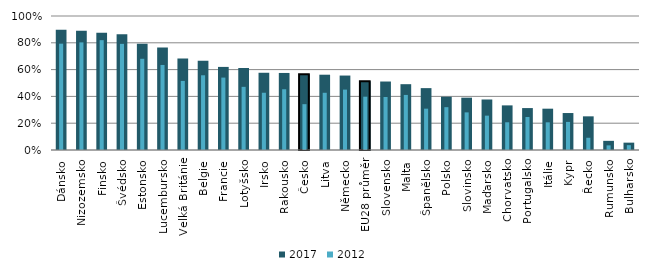
| Category | 2017 |
|---|---|
| Dánsko | 0.898 |
| Nizozemsko | 0.889 |
| Finsko | 0.874 |
| Švédsko | 0.865 |
| Estonsko | 0.792 |
| Lucembursko | 0.764 |
| Velká Británie | 0.684 |
| Belgie | 0.666 |
| Francie | 0.62 |
| Lotyšsko | 0.612 |
| Irsko | 0.576 |
| Rakousko | 0.575 |
| Česko | 0.566 |
| Litva | 0.562 |
| Německo | 0.556 |
| EU28 průměr | 0.513 |
| Slovensko | 0.511 |
| Malta | 0.491 |
| Španělsko | 0.462 |
| Polsko | 0.398 |
| Slovinsko | 0.391 |
| Maďarsko | 0.377 |
| Chorvatsko | 0.333 |
| Portugalsko | 0.313 |
| Itálie | 0.308 |
| Kypr | 0.276 |
| Řecko | 0.251 |
| Rumunsko | 0.068 |
| Bulharsko | 0.055 |